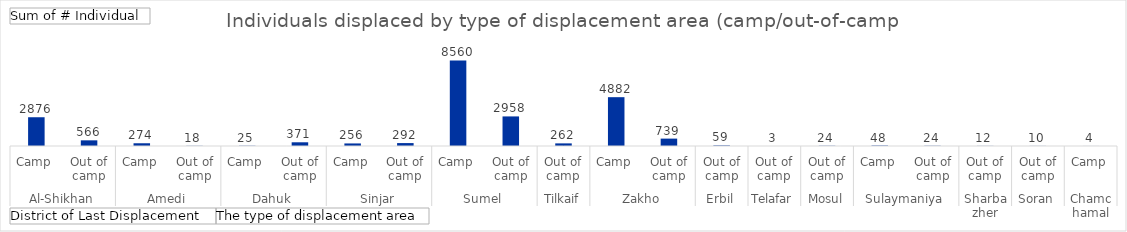
| Category | Total |
|---|---|
| 0 | 2876 |
| 1 | 566 |
| 2 | 274 |
| 3 | 18 |
| 4 | 25 |
| 5 | 371 |
| 6 | 256 |
| 7 | 292 |
| 8 | 8560 |
| 9 | 2958 |
| 10 | 262 |
| 11 | 4882 |
| 12 | 739 |
| 13 | 59 |
| 14 | 3 |
| 15 | 24 |
| 16 | 48 |
| 17 | 24 |
| 18 | 12 |
| 19 | 10 |
| 20 | 4 |